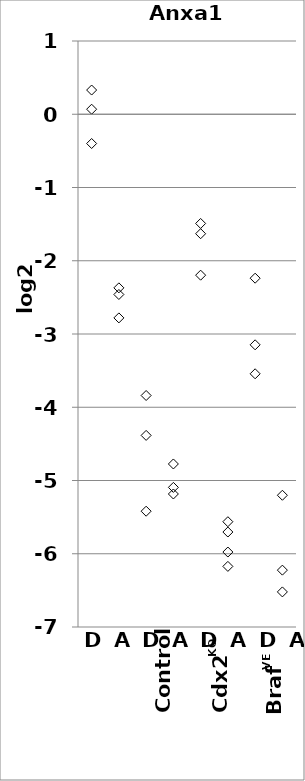
| Category | Anxa10 |
|---|---|
| 1.0 | -0.399 |
| 1.0 | 0.331 |
| 1.0 | 0.069 |
| 2.0 | -2.461 |
| 2.0 | -2.37 |
| 2.0 | -2.78 |
| 3.0 | -5.419 |
| 3.0 | -3.84 |
| 3.0 | -4.384 |
| 4.0 | -4.775 |
| 4.0 | -5.094 |
| 4.0 | -5.184 |
| 5.0 | -1.491 |
| 5.0 | -2.197 |
| 5.0 | -1.631 |
| 6.0 | -5.977 |
| 6.0 | -6.173 |
| 6.0 | -5.563 |
| 6.0 | -5.703 |
| 7.0 | -2.238 |
| 7.0 | -3.148 |
| 7.0 | -3.543 |
| 8.0 | -5.201 |
| 8.0 | -6.224 |
| 8.0 | -6.521 |